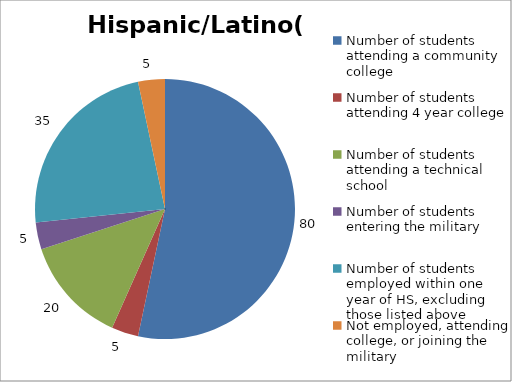
| Category | Hispanic/Latino(a) |
|---|---|
| Number of students attending a community college | 80 |
| Number of students attending 4 year college | 5 |
| Number of students attending a technical school | 20 |
| Number of students entering the military | 5 |
| Number of students employed within one year of HS, excluding those listed above | 35 |
| Not employed, attending college, or joining the military | 5 |